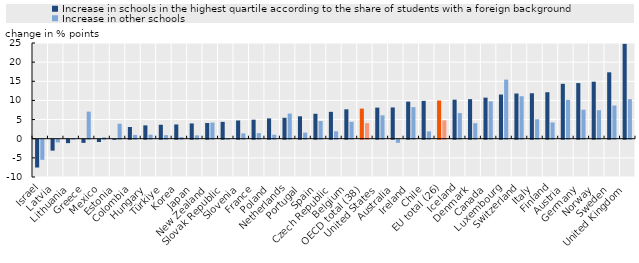
| Category | Increase in schools in the highest quartile according to the share of students with a foreign background | Increase in other schools |
|---|---|---|
| Israel | -7.261 | -5.249 |
| Latvia | -2.852 | -0.708 |
| Lithuania | -0.894 | 0.04 |
| Greece | -0.822 | 7.07 |
| Mexico | -0.592 | 0.365 |
| Estonia | -0.031 | 3.898 |
| Colombia | 3.06 | 0.997 |
| Hungary | 3.486 | 1.052 |
| Türkiye | 3.645 | 0.935 |
| Korea | 3.724 | 0.438 |
| Japan | 3.989 | 0.878 |
| New Zealand | 4.103 | 4.22 |
| Slovak Republic | 4.403 | 0.078 |
| Slovenia | 4.767 | 1.403 |
| France | 4.968 | 1.46 |
| Poland | 5.303 | 1.048 |
| Netherlands | 5.465 | 6.565 |
| Portugal | 5.853 | 1.582 |
| Spain | 6.515 | 4.617 |
| Czech Republic | 7.025 | 1.938 |
| Belgium | 7.679 | 4.419 |
| OECD total (38) | 7.86 | 4.06 |
| United States | 8.125 | 6.111 |
| Australia | 8.168 | -0.81 |
| Ireland | 9.69 | 8.246 |
| Chile | 9.889 | 1.916 |
| EU total (26) | 9.982 | 4.806 |
| Iceland | 10.189 | 6.691 |
| Denmark | 10.329 | 4.048 |
| Canada | 10.729 | 9.779 |
| Luxembourg | 11.538 | 15.436 |
| Switzerland | 11.812 | 11.096 |
| Italy | 11.876 | 5.089 |
| Finland | 12.145 | 4.242 |
| Austria | 14.346 | 10.141 |
| Germany | 14.541 | 7.571 |
| Norway | 14.894 | 7.446 |
| Sweden | 17.346 | 8.673 |
| United Kingdom | 24.781 | 10.33 |